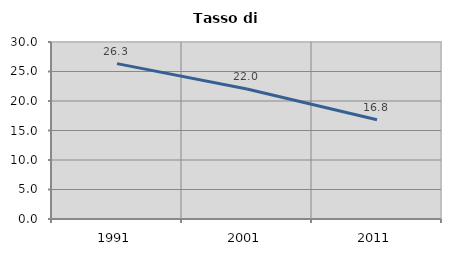
| Category | Tasso di disoccupazione   |
|---|---|
| 1991.0 | 26.338 |
| 2001.0 | 22.039 |
| 2011.0 | 16.822 |